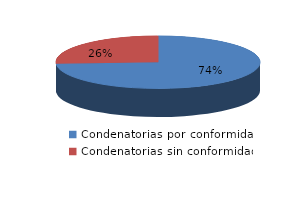
| Category | Series 0 |
|---|---|
| 0 | 40 |
| 1 | 14 |